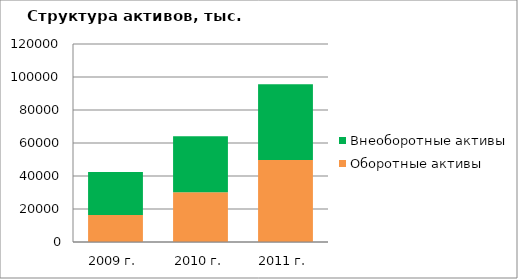
| Category | Оборотные активы | Внеоборотные активы |
|---|---|---|
| 2009 г. | 16420 | 26020 |
| 2010 г. | 30191 | 33935 |
| 2011 г. | 49664 | 45954 |